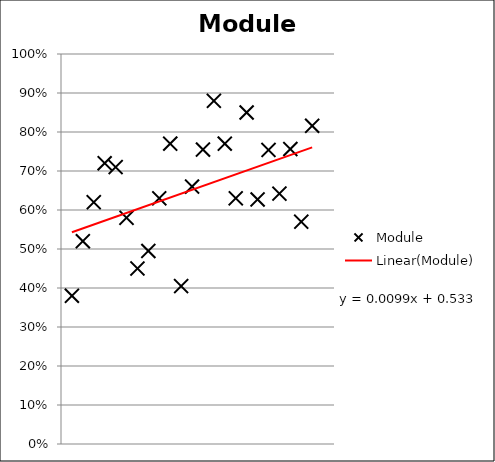
| Category | Module |
|---|---|
| 0 | 0.38 |
| 1 | 0.52 |
| 2 | 0.62 |
| 3 | 0.72 |
| 4 | 0.71 |
| 5 | 0.58 |
| 6 | 0.45 |
| 7 | 0.495 |
| 8 | 0.63 |
| 9 | 0.77 |
| 10 | 0.405 |
| 11 | 0.66 |
| 12 | 0.755 |
| 13 | 0.88 |
| 14 | 0.77 |
| 15 | 0.63 |
| 16 | 0.85 |
| 17 | 0.627 |
| 18 | 0.754 |
| 19 | 0.642 |
| 20 | 0.756 |
| 21 | 0.57 |
| 22 | 0.816 |